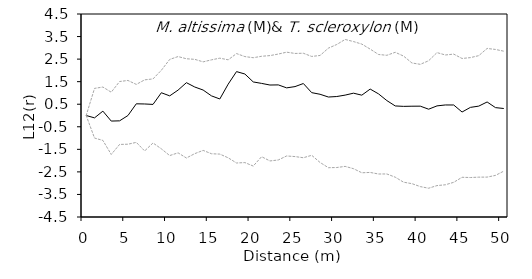
| Category | L12(r) | E12- | E12+ |
|---|---|---|---|
| 0.0 | 0 | 0 | 0 |
| 1.0 | -0.105 | -1 | 1.202 |
| 2.0 | 0.194 | -1.105 | 1.262 |
| 3.0 | -0.247 | -1.727 | 1.032 |
| 4.0 | -0.237 | -1.283 | 1.506 |
| 5.0 | -0.001 | -1.273 | 1.554 |
| 6.0 | 0.518 | -1.191 | 1.378 |
| 7.0 | 0.511 | -1.57 | 1.58 |
| 8.0 | 0.491 | -1.218 | 1.622 |
| 9.0 | 1.009 | -1.478 | 2.005 |
| 10.0 | 0.87 | -1.776 | 2.486 |
| 11.0 | 1.125 | -1.656 | 2.613 |
| 12.0 | 1.455 | -1.884 | 2.515 |
| 13.0 | 1.263 | -1.691 | 2.49 |
| 14.0 | 1.129 | -1.547 | 2.378 |
| 15.0 | 0.87 | -1.695 | 2.467 |
| 16.0 | 0.733 | -1.712 | 2.542 |
| 17.0 | 1.39 | -1.876 | 2.468 |
| 18.0 | 1.946 | -2.106 | 2.746 |
| 19.0 | 1.839 | -2.087 | 2.612 |
| 20.0 | 1.488 | -2.241 | 2.562 |
| 21.0 | 1.423 | -1.826 | 2.625 |
| 22.0 | 1.351 | -2.015 | 2.656 |
| 23.0 | 1.357 | -1.971 | 2.724 |
| 24.0 | 1.225 | -1.794 | 2.808 |
| 25.0 | 1.281 | -1.821 | 2.752 |
| 26.0 | 1.418 | -1.872 | 2.76 |
| 27.0 | 1.013 | -1.764 | 2.618 |
| 28.0 | 0.941 | -2.082 | 2.662 |
| 29.0 | 0.819 | -2.314 | 2.986 |
| 30.0 | 0.841 | -2.306 | 3.148 |
| 31.0 | 0.904 | -2.256 | 3.372 |
| 32.0 | 0.99 | -2.357 | 3.279 |
| 33.0 | 0.902 | -2.539 | 3.165 |
| 34.0 | 1.172 | -2.525 | 2.944 |
| 35.0 | 0.959 | -2.593 | 2.705 |
| 36.0 | 0.661 | -2.592 | 2.669 |
| 37.0 | 0.423 | -2.735 | 2.802 |
| 38.0 | 0.405 | -2.957 | 2.634 |
| 39.0 | 0.412 | -3.022 | 2.328 |
| 40.0 | 0.414 | -3.152 | 2.269 |
| 41.0 | 0.28 | -3.224 | 2.428 |
| 42.0 | 0.426 | -3.107 | 2.789 |
| 43.0 | 0.467 | -3.072 | 2.683 |
| 44.0 | 0.466 | -2.962 | 2.722 |
| 45.0 | 0.154 | -2.739 | 2.528 |
| 46.0 | 0.36 | -2.75 | 2.566 |
| 47.0 | 0.416 | -2.734 | 2.653 |
| 48.0 | 0.6 | -2.731 | 2.973 |
| 49.0 | 0.349 | -2.655 | 2.928 |
| 50.0 | 0.31 | -2.466 | 2.852 |